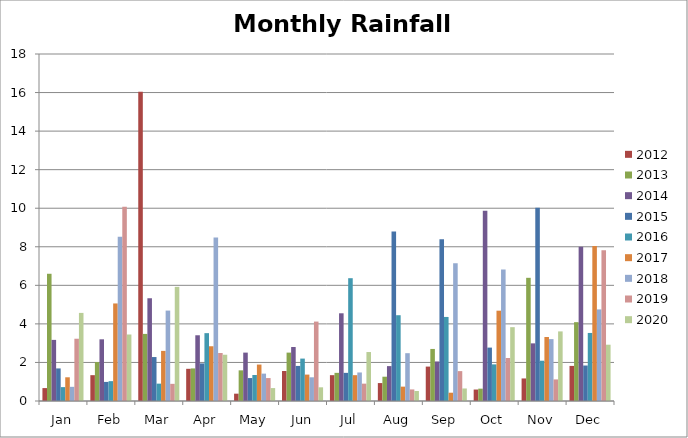
| Category | 2012 | 2013 | 2014 | 2015 | 2016 | 2017 | 2018 | 2019 | 2020 |
|---|---|---|---|---|---|---|---|---|---|
| Jan | 0.67 | 6.6 | 3.17 | 1.69 | 0.72 | 1.23 | 0.735 | 3.23 | 4.57 |
| Feb | 1.34 | 2.02 | 3.2 | 0.99 | 1.03 | 5.06 | 8.525 | 10.08 | 3.45 |
| Mar | 16.04 | 3.48 | 5.33 | 2.28 | 0.9 | 2.6 | 4.69 | 0.89 | 5.92 |
| Apr | 1.67 | 1.69 | 3.41 | 1.95 | 3.52 | 2.84 | 8.48 | 2.49 | 2.4 |
| May | 0.38 | 1.59 | 2.51 | 1.19 | 1.35 | 1.89 | 1.42 | 1.19 | 0.67 |
| Jun | 1.555 | 2.51 | 2.8 | 1.82 | 2.2 | 1.37 | 1.23 | 4.12 | 0.71 |
| Jul | 1.34 | 1.46 | 4.55 | 1.46 | 6.37 | 1.34 | 1.48 | 0.9 | 2.54 |
| Aug | 0.93 | 1.26 | 1.81 | 8.79 | 4.45 | 0.745 | 2.48 | 0.6 | 0.52 |
| Sep | 1.785 | 2.7 | 2.05 | 8.39 | 4.36 | 0.43 | 7.15 | 1.55 | 0.65 |
| Oct | 0.595 | 0.64 | 9.87 | 2.77 | 1.9 | 4.685 | 6.82 | 2.23 | 3.83 |
| Nov | 1.17 | 6.39 | 2.99 | 10.03 | 2.09 | 3.32 | 3.21 | 1.12 | 3.61 |
| Dec | 1.82 | 4.09 | 8 | 1.84 | 3.53 | 8.04 | 4.75 | 7.82 | 2.92 |